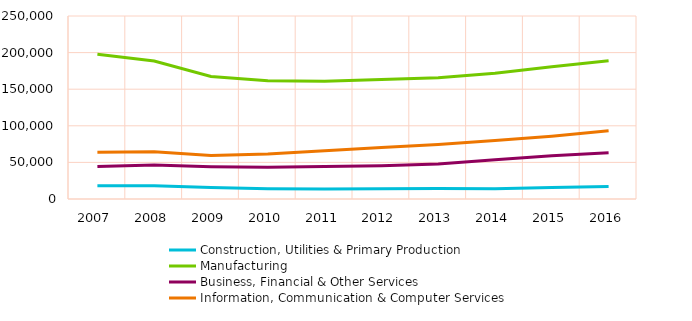
| Category | Construction, Utilities & Primary Production | Manufacturing | Business, Financial & Other Services | Information, Communication & Computer Services |
|---|---|---|---|---|
| 2007.0 | 18072 | 197806 | 44256 | 63971 |
| 2008.0 | 18098 | 188622 | 46582 | 64679 |
| 2009.0 | 15692 | 167407 | 44174 | 59357 |
| 2010.0 | 14104 | 161548 | 43415 | 61453 |
| 2011.0 | 13637 | 160709 | 44256 | 65852 |
| 2012.0 | 13998 | 163118 | 45530 | 70223 |
| 2013.0 | 14303 | 165613 | 47970 | 74515 |
| 2014.0 | 14085 | 171657 | 53581 | 79761 |
| 2015.0 | 15776 | 180713 | 59213 | 85710 |
| 2016.0 | 17125 | 188722 | 63095 | 93102 |